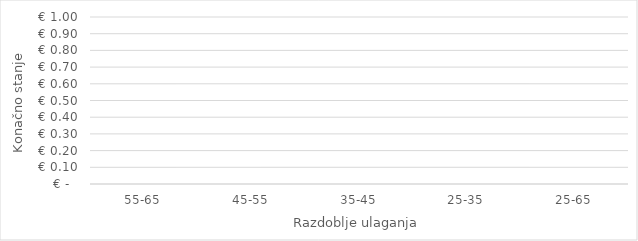
| Category | Series 0 |
|---|---|
| 55-65 | 0 |
| 45-55 | 0 |
| 35-45 | 0 |
| 25-35 | 0 |
| 25-65 | 0 |